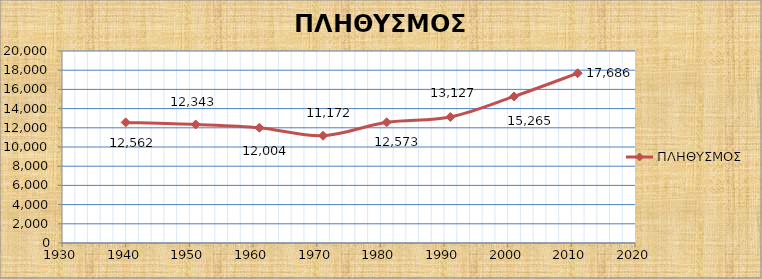
| Category | ΠΛΗΘΥΣΜΟΣ |
|---|---|
| 0 | 12562 |
| 1 | 12343 |
| 2 | 12004 |
| 3 | 11172 |
| 4 | 12573 |
| 5 | 13127 |
| 6 | 15265 |
| 7 | 17686 |